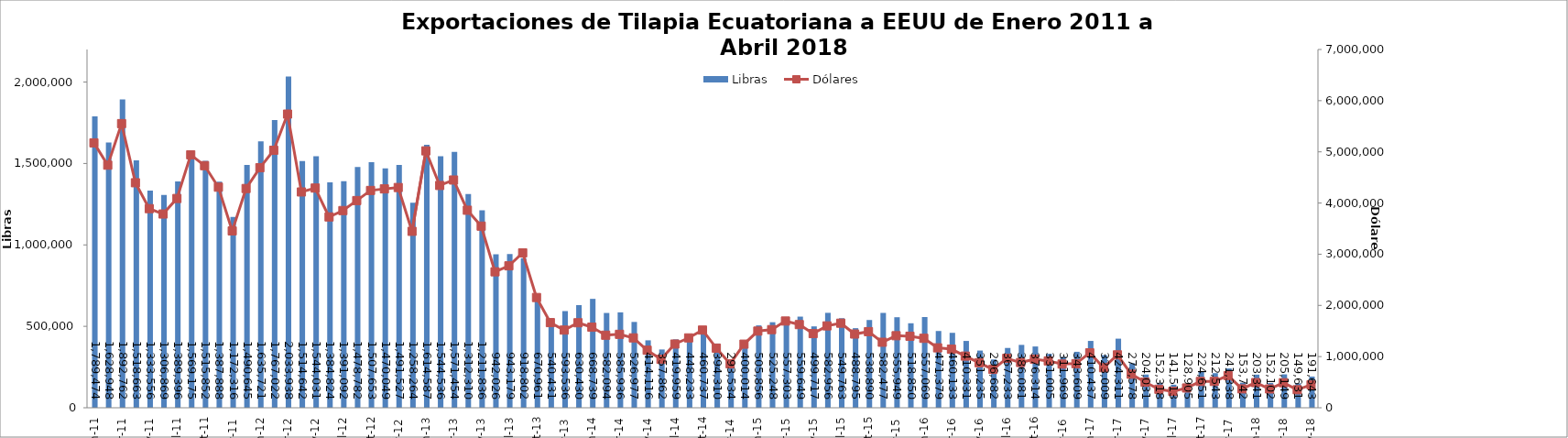
| Category | Libras  |
|---|---|
| 2011-01-01 | 1789473.82 |
| 2011-02-01 | 1628948.076 |
| 2011-03-01 | 1892761.535 |
| 2011-04-01 | 1518662.961 |
| 2011-05-01 | 1333555.926 |
| 2011-06-01 | 1306869.243 |
| 2011-07-01 | 1389396.24 |
| 2011-08-01 | 1569174.756 |
| 2011-09-01 | 1515852.096 |
| 2011-10-01 | 1387888.293 |
| 2011-11-01 | 1172315.891 |
| 2011-12-01 | 1490644.699 |
| 2012-01-01 | 1635720.607 |
| 2012-02-01 | 1767022.174 |
| 2012-03-01 | 2033937.505 |
| 2012-04-01 | 1514641.77 |
| 2012-05-01 | 1544031.293 |
| 2012-06-01 | 1384823.899 |
| 2012-07-01 | 1391091.577 |
| 2012-08-01 | 1478781.747 |
| 2012-09-01 | 1507653.188 |
| 2012-10-01 | 1470049.326 |
| 2012-11-01 | 1491526.539 |
| 2012-12-01 | 1258264 |
| 2013-01-01 | 1614587 |
| 2013-02-01 | 1544536.146 |
| 2013-03-01 | 1571454.312 |
| 2013-04-01 | 1312310.196 |
| 2013-05-01 | 1211835.551 |
| 2013-06-01 | 942025.58 |
| 2013-07-01 | 943178.586 |
| 2013-08-01 | 918802.324 |
| 2013-09-01 | 670961.192 |
| 2013-10-01 | 540431.235 |
| 2013-11-01 | 593535.64 |
| 2013-12-01 | 630429.621 |
| 2014-01-01 | 668739 |
| 2014-02-01 | 582093.766 |
| 2014-03-01 | 585936.383 |
| 2014-04-01 | 526976.561 |
| 2014-05-01 | 414116.473 |
| 2014-06-01 | 357861.695 |
| 2014-07-01 | 419958.663 |
| 2014-08-01 | 448233 |
| 2014-09-01 | 460737.149 |
| 2014-10-01 | 394310.347 |
| 2014-11-01 | 293533.672 |
| 2014-12-01 | 400013.647 |
| 2015-01-01 | 505856.493 |
| 2015-02-01 | 525248 |
| 2015-03-01 | 557303.039 |
| 2015-04-01 | 559648.733 |
| 2015-05-01 | 499716.682 |
| 2015-06-01 | 582955.764 |
| 2015-07-01 | 549763.307 |
| 2015-08-01 | 488795.094 |
| 2015-09-01 | 538890.219 |
| 2015-10-01 | 582477.366 |
| 2015-11-01 | 555949.414 |
| 2015-12-01 | 518850.405 |
| 2016-01-01 | 557069.351 |
| 2016-02-01 | 471378.754 |
| 2016-03-01 | 460133.089 |
| 2016-04-01 | 410331.175 |
| 2016-05-01 | 351235 |
| 2016-06-01 | 296682 |
| 2016-07-01 | 367233.45 |
| 2016-08-01 | 386080.575 |
| 2016-09-01 | 376314.197 |
| 2016-10-01 | 331005.258 |
| 2016-11-01 | 311968.537 |
| 2016-12-01 | 343608.956 |
| 2017-01-01 | 410436.996 |
| 2017-02-01 | 323009.174 |
| 2017-03-01 | 424310.544 |
| 2017-04-01 | 273577.632 |
| 2017-05-01 | 204031.321 |
| 2017-06-01 | 152318.019 |
| 2017-07-01 | 141513.274 |
| 2017-08-01 | 128905.167 |
| 2017-09-01 | 224650.945 |
| 2017-10-01 | 212543.281 |
| 2017-11-01 | 241337.562 |
| 2017-12-01 | 153742.19 |
| 2018-01-01 | 203341.281 |
| 2018-02-01 | 152101.968 |
| 2018-03-01 | 205149.053 |
| 2018-04-01 | 149630.611 |
| 2018-05-01 | 191643 |